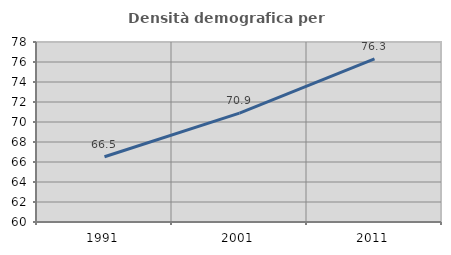
| Category | Densità demografica |
|---|---|
| 1991.0 | 66.526 |
| 2001.0 | 70.892 |
| 2011.0 | 76.316 |